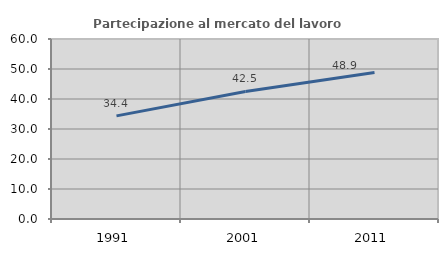
| Category | Partecipazione al mercato del lavoro  femminile |
|---|---|
| 1991.0 | 34.383 |
| 2001.0 | 42.529 |
| 2011.0 | 48.864 |